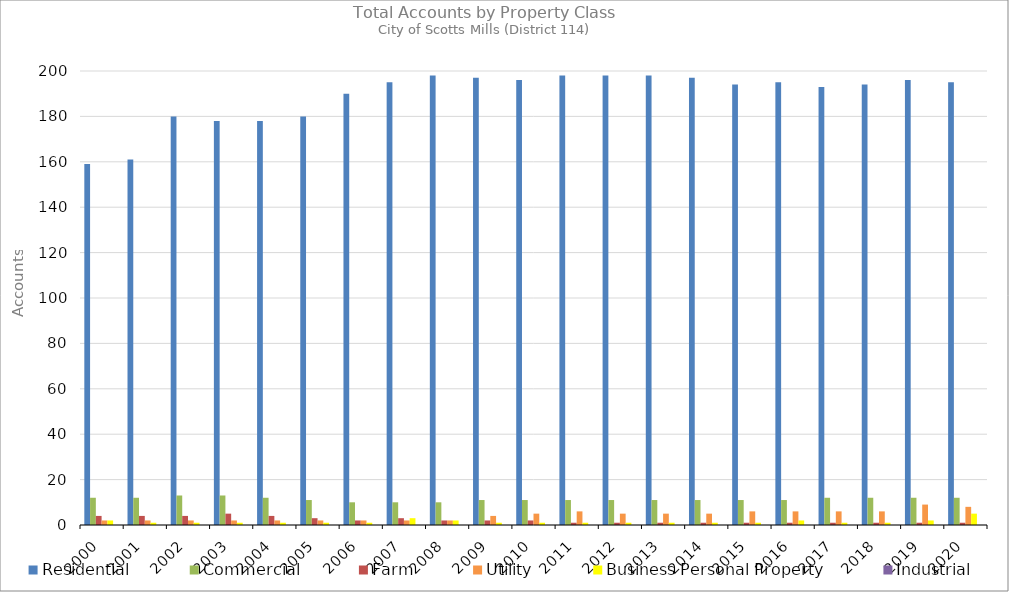
| Category | Residential | Commercial | Farm | Utility | Business Personal Property | Industrial |
|---|---|---|---|---|---|---|
| 2000.0 | 159 | 12 | 4 | 2 | 2 | 0 |
| 2001.0 | 161 | 12 | 4 | 2 | 1 | 0 |
| 2002.0 | 180 | 13 | 4 | 2 | 1 | 0 |
| 2003.0 | 178 | 13 | 5 | 2 | 1 | 0 |
| 2004.0 | 178 | 12 | 4 | 2 | 1 | 0 |
| 2005.0 | 180 | 11 | 3 | 2 | 1 | 0 |
| 2006.0 | 190 | 10 | 2 | 2 | 1 | 0 |
| 2007.0 | 195 | 10 | 3 | 2 | 3 | 0 |
| 2008.0 | 198 | 10 | 2 | 2 | 2 | 0 |
| 2009.0 | 197 | 11 | 2 | 4 | 1 | 0 |
| 2010.0 | 196 | 11 | 2 | 5 | 1 | 0 |
| 2011.0 | 198 | 11 | 1 | 6 | 1 | 0 |
| 2012.0 | 198 | 11 | 1 | 5 | 1 | 0 |
| 2013.0 | 198 | 11 | 1 | 5 | 1 | 0 |
| 2014.0 | 197 | 11 | 1 | 5 | 1 | 0 |
| 2015.0 | 194 | 11 | 1 | 6 | 1 | 0 |
| 2016.0 | 195 | 11 | 1 | 6 | 2 | 0 |
| 2017.0 | 193 | 12 | 1 | 6 | 1 | 0 |
| 2018.0 | 194 | 12 | 1 | 6 | 1 | 0 |
| 2019.0 | 196 | 12 | 1 | 9 | 2 | 0 |
| 2020.0 | 195 | 12 | 1 | 8 | 5 | 0 |